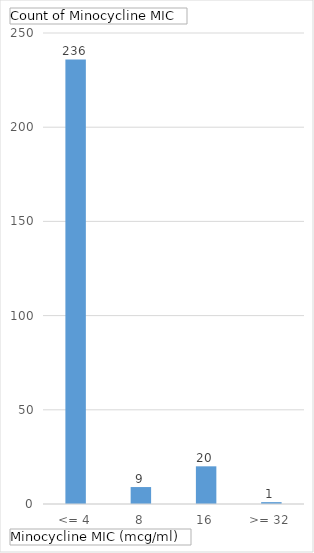
| Category | Total |
|---|---|
| <= 4 | 236 |
| 8 | 9 |
| 16 | 20 |
| >= 32 | 1 |